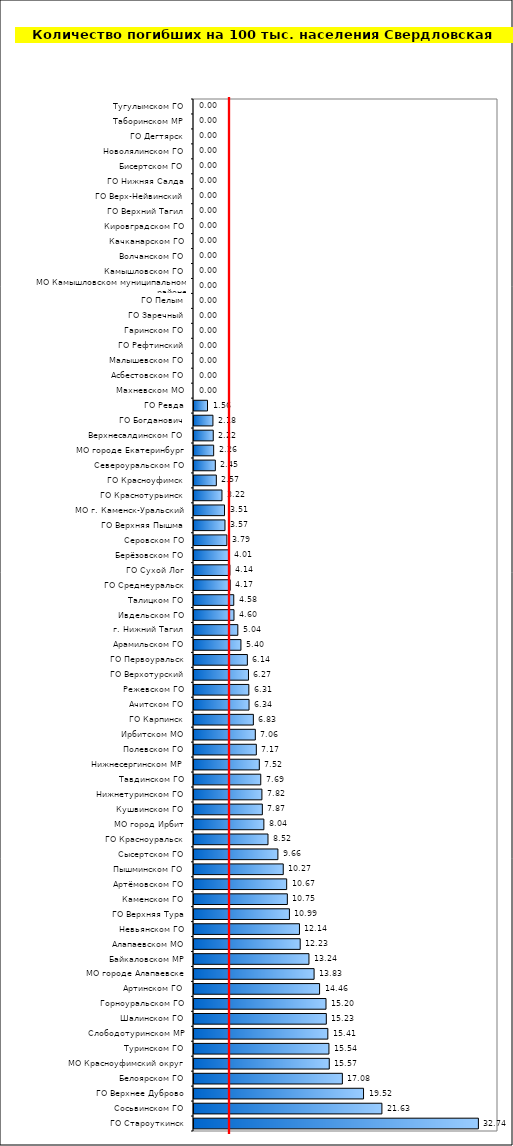
| Category | Series 0 |
|---|---|
| ГО Староуткинск | 32.744 |
| Сосьвинском ГО | 21.634 |
| ГО Верхнее Дуброво | 19.52 |
| Белоярском ГО | 17.082 |
| МО Красноуфимский округ | 15.572 |
| Туринском ГО | 15.537 |
| Слободотуринском МР | 15.41 |
| Шалинском ГО | 15.233 |
| Горноуральском ГО | 15.199 |
| Артинском ГО | 14.458 |
| МО городе Алапаевске | 13.826 |
| Байкаловском МР | 13.236 |
| Алапаевском МО | 12.226 |
| Невьянском ГО | 12.142 |
| ГО Верхняя Тура | 10.985 |
| Каменском ГО | 10.746 |
| Артёмовском ГО | 10.67 |
| Пышминском ГО | 10.274 |
| Сысертском ГО | 9.659 |
| ГО Красноуральск | 8.52 |
| МО город Ирбит | 8.044 |
| Кушвинском ГО | 7.867 |
| Нижнетуринском ГО | 7.818 |
| Тавдинском ГО | 7.686 |
| Нижнесергинском МР | 7.518 |
| Полевском ГО | 7.174 |
| Ирбитском МО | 7.059 |
| ГО Карпинск | 6.832 |
| Ачитском ГО | 6.337 |
| Режевском ГО | 6.314 |
| ГО Верхотурский | 6.272 |
| ГО Первоуральск | 6.142 |
| Арамильском ГО | 5.404 |
| г. Нижний Тагил | 5.045 |
| Ивдельском ГО | 4.602 |
| Талицком ГО | 4.577 |
| ГО Среднеуральск | 4.166 |
| ГО Сухой Лог | 4.135 |
| Берёзовском ГО | 4.011 |
| Серовском ГО | 3.785 |
| ГО Верхняя Пышма | 3.567 |
| МО г. Каменск-Уральский | 3.512 |
| ГО Краснотурьинск | 3.22 |
| ГО Красноуфимск | 2.57 |
| Североуральском ГО | 2.455 |
| МО городе Екатеринбург | 2.264 |
| Верхнесалдинском ГО | 2.215 |
| ГО Богданович | 2.18 |
| ГО Ревда | 1.555 |
| Махневском МО | 0 |
| Асбестовском ГО | 0 |
| Малышевском ГО | 0 |
| ГО Рефтинский | 0 |
| Гаринском ГО | 0 |
| ГО Заречный | 0 |
| ГО Пелым | 0 |
| МО Камышловском муниципальном районе | 0 |
| Камышловском ГО | 0 |
| Волчанском ГО | 0 |
| Качканарском ГО | 0 |
| Кировградском ГО | 0 |
| ГО Верхний Тагил | 0 |
| ГО Верх-Нейвинский | 0 |
| ГО Нижняя Салда | 0 |
| Бисертском ГО | 0 |
| Новолялинском ГО | 0 |
| ГО Дегтярск | 0 |
| Таборинском МР | 0 |
| Тугулымском ГО | 0 |